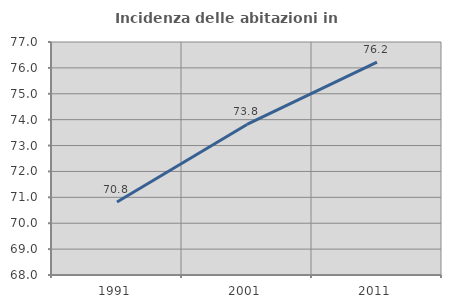
| Category | Incidenza delle abitazioni in proprietà  |
|---|---|
| 1991.0 | 70.818 |
| 2001.0 | 73.817 |
| 2011.0 | 76.22 |